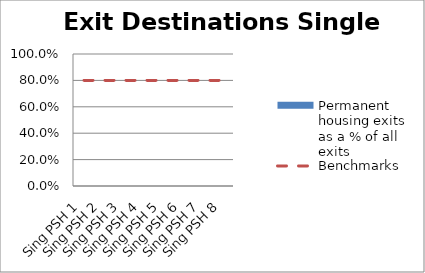
| Category | Permanent housing exits as a % of all exits |
|---|---|
| Sing PSH 1 | 0 |
| Sing PSH 2 | 0 |
| Sing PSH 3 | 0 |
| Sing PSH 4 | 0 |
| Sing PSH 5 | 0 |
| Sing PSH 6 | 0 |
| Sing PSH 7 | 0 |
| Sing PSH 8 | 0 |